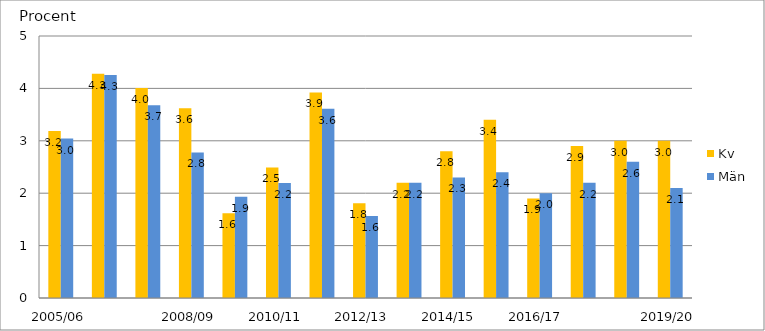
| Category | Kv | Män |
|---|---|---|
| 2005/06 | 3.189 | 3.043 |
|  | 4.278 | 4.254 |
|  | 4.008 | 3.681 |
| 2008/09 | 3.622 | 2.778 |
|  | 1.617 | 1.933 |
| 2010/11 | 2.492 | 2.194 |
|  | 3.922 | 3.613 |
| 2012/13  | 1.807 | 1.563 |
|  | 2.2 | 2.2 |
| 2014/15  | 2.8 | 2.3 |
|  | 3.4 | 2.4 |
| 2016/17  | 1.9 | 2 |
|  | 2.9 | 2.2 |
|  | 3 | 2.6 |
| 2019/20 | 3 | 2.1 |